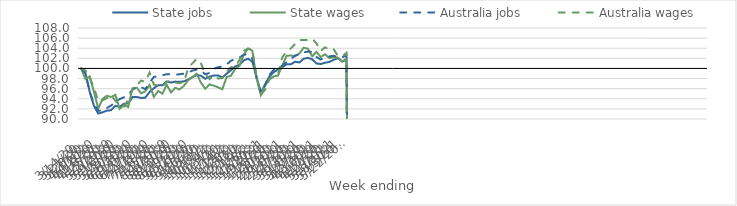
| Category | State jobs | State wages | Australia jobs | Australia wages |
|---|---|---|---|---|
| 14/03/2020 | 100 | 100 | 100 | 100 |
| 21/03/2020 | 99.13 | 97.902 | 98.971 | 99.605 |
| 28/03/2020 | 95.37 | 98.421 | 95.467 | 98.107 |
| 04/04/2020 | 92.585 | 95.326 | 92.92 | 96.258 |
| 11/04/2020 | 91.076 | 92.074 | 91.648 | 93.491 |
| 18/04/2020 | 91.324 | 93.954 | 91.631 | 93.694 |
| 25/04/2020 | 91.65 | 94.632 | 92.162 | 94.113 |
| 02/05/2020 | 91.734 | 94.326 | 92.658 | 94.675 |
| 09/05/2020 | 92.612 | 94.787 | 93.343 | 93.583 |
| 16/05/2020 | 92.393 | 92.015 | 93.936 | 92.817 |
| 23/05/2020 | 93.019 | 92.76 | 94.293 | 92.47 |
| 30/05/2020 | 93.059 | 92.369 | 94.8 | 93.82 |
| 06/06/2020 | 94.349 | 96.068 | 95.784 | 95.934 |
| 13/06/2020 | 94.356 | 96.197 | 96.283 | 96.613 |
| 20/06/2020 | 94.164 | 95.061 | 96.299 | 97.596 |
| 27/06/2020 | 94.226 | 95.488 | 95.908 | 97.351 |
| 04/07/2020 | 95.366 | 96.733 | 97.201 | 99.182 |
| 11/07/2020 | 96.097 | 94.365 | 98.328 | 96.791 |
| 18/07/2020 | 96.666 | 95.552 | 98.432 | 96.609 |
| 25/07/2020 | 96.692 | 95.001 | 98.653 | 96.408 |
| 01/08/2020 | 97.426 | 96.772 | 98.875 | 97.263 |
| 08/08/2020 | 97.213 | 95.25 | 98.872 | 97.698 |
| 15/08/2020 | 97.401 | 96.165 | 98.757 | 97.212 |
| 22/08/2020 | 97.341 | 95.854 | 98.844 | 97.073 |
| 29/08/2020 | 97.448 | 96.55 | 98.982 | 97.295 |
| 05/09/2020 | 97.785 | 97.654 | 99.167 | 100.035 |
| 12/09/2020 | 98.274 | 98.278 | 99.586 | 101.016 |
| 19/09/2020 | 98.706 | 98.949 | 99.757 | 101.878 |
| 26/09/2020 | 98.565 | 97.196 | 99.556 | 101.032 |
| 03/10/2020 | 97.947 | 95.983 | 98.852 | 98.907 |
| 10/10/2020 | 98.376 | 96.847 | 99.105 | 97.892 |
| 17/10/2020 | 98.597 | 96.588 | 99.955 | 98.589 |
| 24/10/2020 | 98.614 | 96.274 | 100.247 | 98.012 |
| 31/10/2020 | 98.213 | 95.884 | 100.384 | 98.084 |
| 07/11/2020 | 98.955 | 98.309 | 100.771 | 99.334 |
| 14/11/2020 | 99.618 | 98.546 | 101.516 | 100.252 |
| 21/11/2020 | 100.396 | 99.917 | 101.84 | 100.323 |
| 28/11/2020 | 100.724 | 100.505 | 102.16 | 101.68 |
| 05/12/2020 | 101.587 | 102.717 | 102.718 | 103.493 |
| 12/12/2020 | 101.924 | 103.925 | 102.789 | 103.93 |
| 19/12/2020 | 101.35 | 103.534 | 101.986 | 103.809 |
| 26/12/2020 | 98.273 | 98.041 | 98.188 | 98.338 |
| 02/01/2021 | 95.173 | 94.72 | 95.282 | 94.812 |
| 09/01/2021 | 96.86 | 96.667 | 96.645 | 95.793 |
| 16/01/2021 | 98.41 | 97.819 | 98.738 | 97.83 |
| 23/01/2021 | 99.248 | 98.42 | 99.703 | 98.519 |
| 30/01/2021 | 99.784 | 98.592 | 100.182 | 98.873 |
| 06/02/2021 | 100.23 | 100.539 | 100.516 | 102.171 |
| 13/02/2021 | 100.846 | 102.485 | 101.256 | 103.38 |
| 20/02/2021 | 100.814 | 102.578 | 101.855 | 103.943 |
| 27/02/2021 | 101.328 | 102.394 | 102.556 | 104.829 |
| 06/03/2021 | 101.182 | 102.965 | 102.809 | 105.611 |
| 13/03/2021 | 101.917 | 104.11 | 103.171 | 105.63 |
| 20/03/2021 | 102.092 | 103.885 | 103.339 | 105.616 |
| 27/03/2021 | 101.802 | 102.419 | 103.246 | 105.876 |
| 03/04/2021 | 100.988 | 103.275 | 102.251 | 104.958 |
| 10/04/2021 | 100.875 | 102.25 | 101.76 | 103.45 |
| 17/04/2021 | 101.142 | 102.809 | 102.161 | 104.184 |
| 24/04/2021 | 101.278 | 102.054 | 102.386 | 103.705 |
| 01/05/2021 | 101.704 | 102.246 | 102.495 | 103.842 |
| 08/05/2021 | 102.017 | 102.151 | 102.264 | 102.466 |
| 15/05/2021 | 101.407 | 101.367 | 102.191 | 102.371 |
| 22/05/2021 | 101.662 | 101.916 | 102.592 | 103.091 |